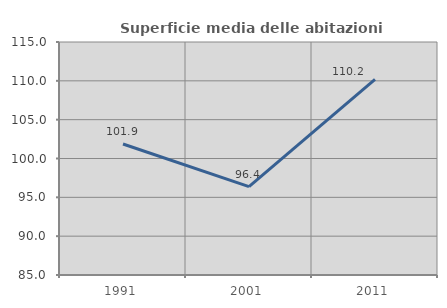
| Category | Superficie media delle abitazioni occupate |
|---|---|
| 1991.0 | 101.872 |
| 2001.0 | 96.369 |
| 2011.0 | 110.176 |